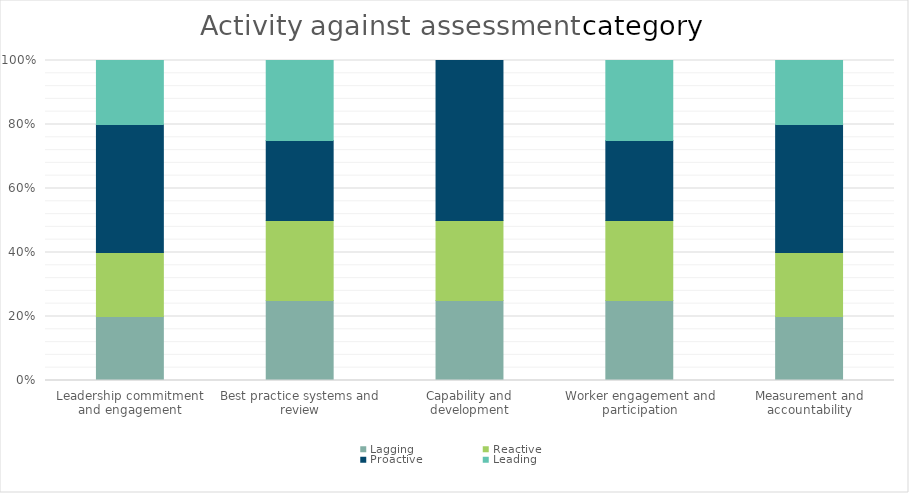
| Category | Lagging | Reactive | Proactive | Leading |
|---|---|---|---|---|
| Leadership commitment and engagement | 1 | 1 | 2 | 1 |
| Best practice systems and review | 1 | 1 | 1 | 1 |
| Capability and development | 1 | 1 | 2 | 0 |
| Worker engagement and participation | 1 | 1 | 1 | 1 |
| Measurement and accountability | 1 | 1 | 2 | 1 |